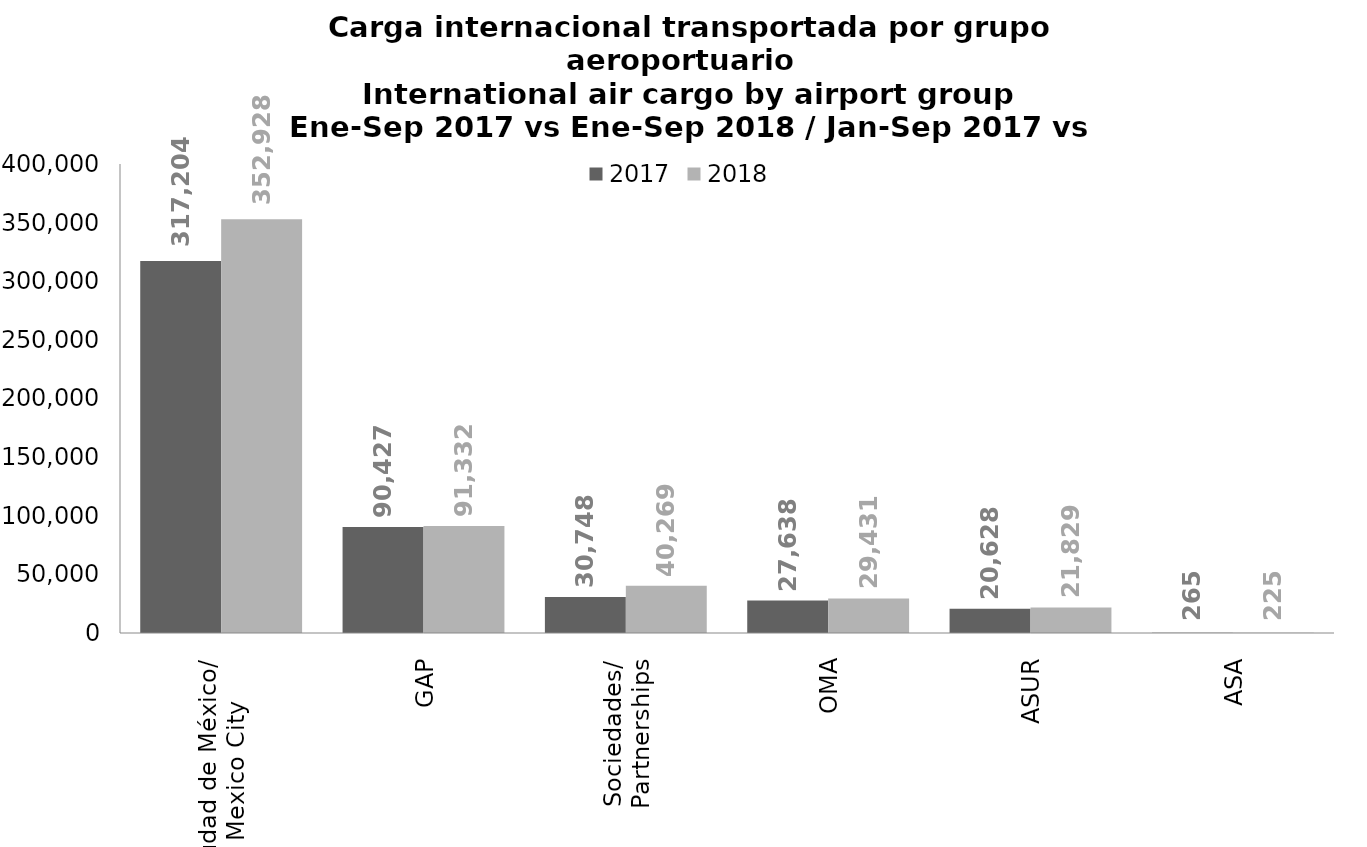
| Category | 2017 | 2018 |
|---|---|---|
| Ciudad de México/
Mexico City | 317204.28 | 352927.76 |
| GAP | 90426.758 | 91332.149 |
| Sociedades/
Partnerships | 30748.043 | 40268.624 |
| OMA | 27638.109 | 29431.105 |
| ASUR | 20627.824 | 21829.417 |
| ASA | 265.183 | 224.661 |